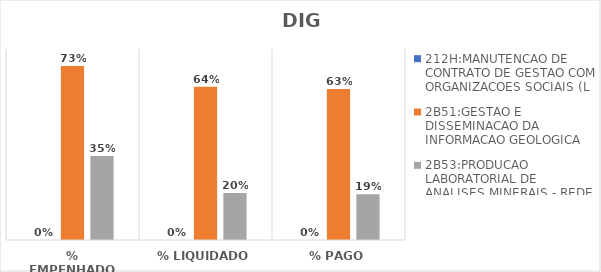
| Category | 212H:MANUTENCAO DE CONTRATO DE GESTAO COM ORGANIZACOES SOCIAIS (L | 2B51:GESTAO E DISSEMINACAO DA INFORMACAO GEOLOGICA | 2B53:PRODUCAO LABORATORIAL DE ANALISES MINERAIS - REDE LAMIN |
|---|---|---|---|
| % EMPENHADO | 0 | 0.729 | 0.351 |
| % LIQUIDADO | 0 | 0.642 | 0.197 |
| % PAGO | 0 | 0.633 | 0.191 |